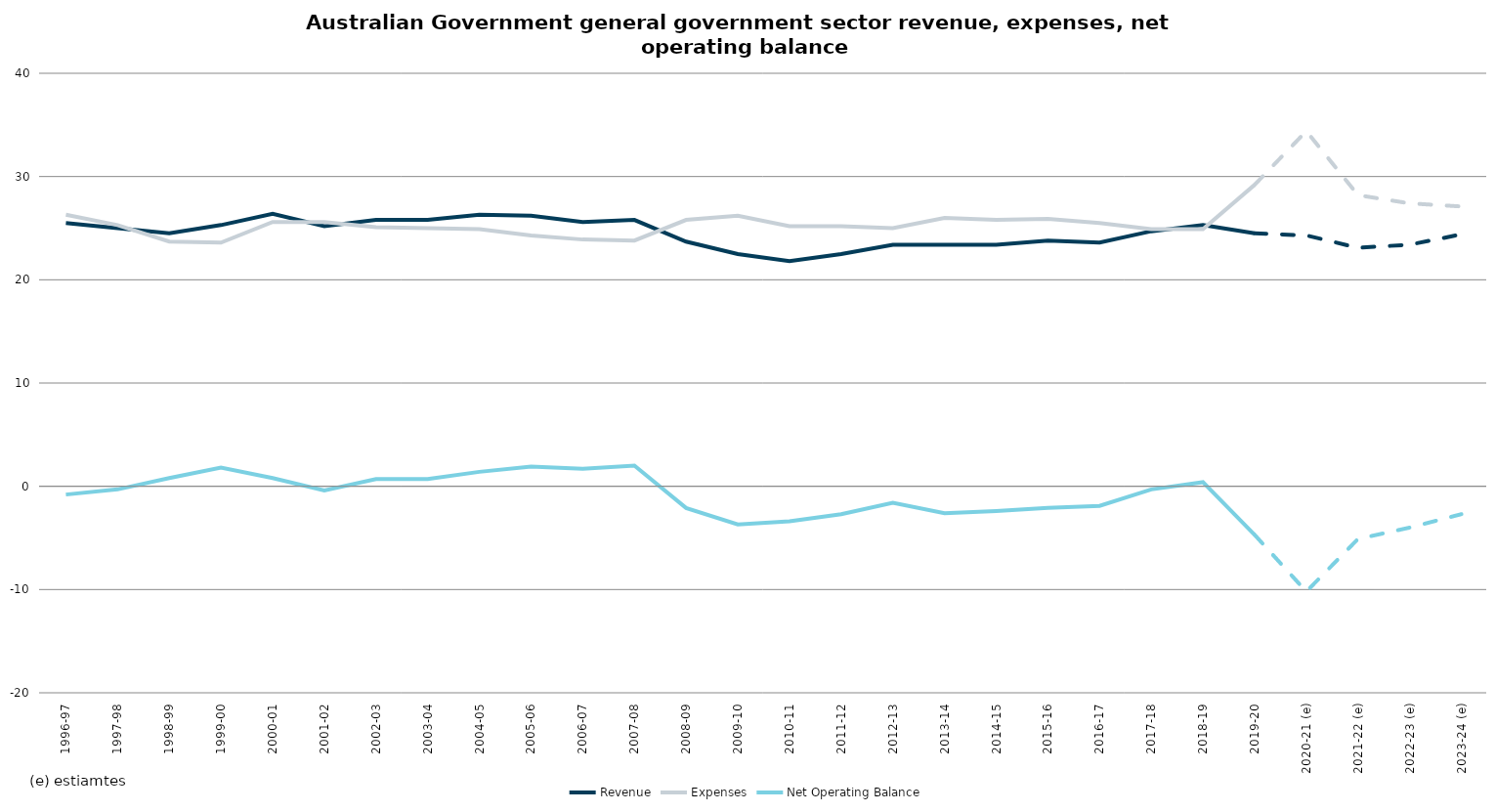
| Category | Revenue | Expenses | Net Operating Balance |
|---|---|---|---|
| 1996-97 | 25.5 | 26.3 | -0.8 |
| 1997-98 | 25 | 25.3 | -0.3 |
| 1998-99 | 24.5 | 23.7 | 0.8 |
| 1999-00 | 25.3 | 23.6 | 1.8 |
| 2000-01 | 26.4 | 25.6 | 0.8 |
| 2001-02 | 25.2 | 25.6 | -0.4 |
| 2002-03 | 25.8 | 25.1 | 0.7 |
| 2003-04 | 25.8 | 25 | 0.7 |
| 2004-05 | 26.3 | 24.9 | 1.4 |
| 2005-06 | 26.2 | 24.3 | 1.9 |
| 2006-07 | 25.6 | 23.9 | 1.7 |
| 2007-08 | 25.8 | 23.8 | 2 |
| 2008-09 | 23.7 | 25.8 | -2.1 |
| 2009-10 | 22.5 | 26.2 | -3.7 |
| 2010-11 | 21.8 | 25.2 | -3.4 |
| 2011-12 | 22.5 | 25.2 | -2.7 |
| 2012-13 | 23.4 | 25 | -1.6 |
| 2013-14 | 23.4 | 26 | -2.6 |
| 2014-15 | 23.4 | 25.8 | -2.4 |
| 2015-16 | 23.8 | 25.9 | -2.1 |
| 2016-17 | 23.6 | 25.5 | -1.9 |
| 2017-18 | 24.7 | 24.9 | -0.3 |
| 2018-19 | 25.3 | 24.9 | 0.4 |
| 2019-20 | 24.5 | 29.2 | -4.7 |
| 2020-21 (e) | 24.3 | 34.4 | -10.2 |
| 2021-22 (e) | 23.1 | 28.2 | -5.1 |
| 2022-23 (e) | 23.4 | 27.4 | -4 |
| 2023-24 (e) | 24.4 | 27.1 | -2.7 |